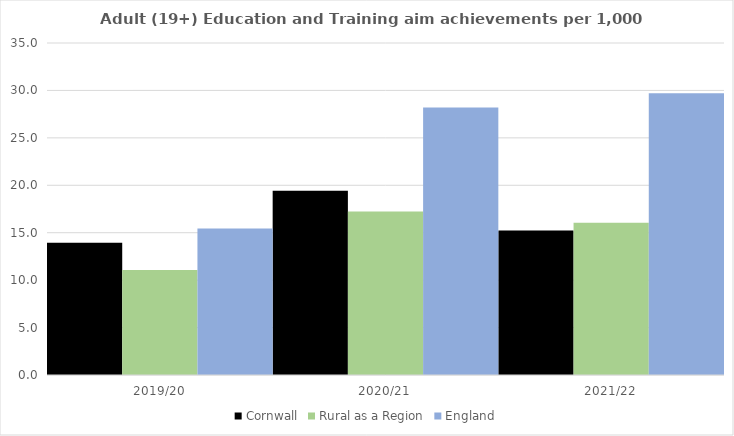
| Category | Cornwall | Rural as a Region | England |
|---|---|---|---|
| 2019/20 | 13.93 | 11.081 | 15.446 |
| 2020/21 | 19.417 | 17.224 | 28.211 |
| 2021/22 | 15.246 | 16.063 | 29.711 |